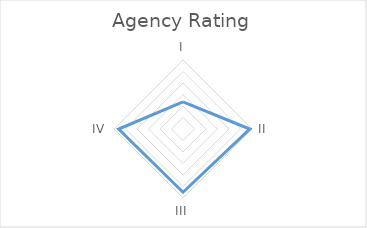
| Category | Series 0 |
|---|---|
| I | 1.182 |
| II | 2.9 |
| III | 2.75 |
| IV | 2.8 |